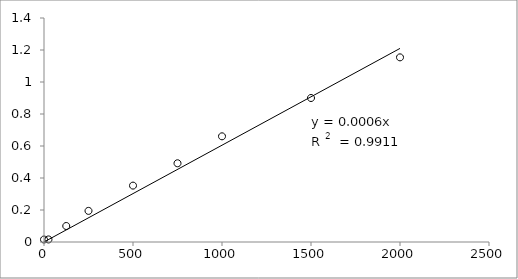
| Category | Series 0 |
|---|---|
| 2000.0 | 1.154 |
| 1500.0 | 0.9 |
| 1000.0 | 0.661 |
| 750.0 | 0.492 |
| 500.0 | 0.352 |
| 250.0 | 0.194 |
| 125.0 | 0.1 |
| 25.0 | 0.016 |
| 0.0 | 0.016 |